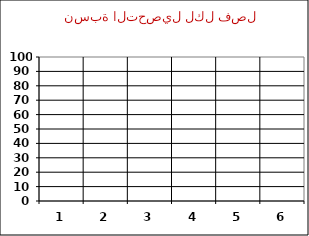
| Category | نسبة التحصيل |
|---|---|
| 0 | 0 |
| 1 | 0 |
| 2 | 0 |
| 3 | 0 |
| 4 | 0 |
| 5 | 0 |